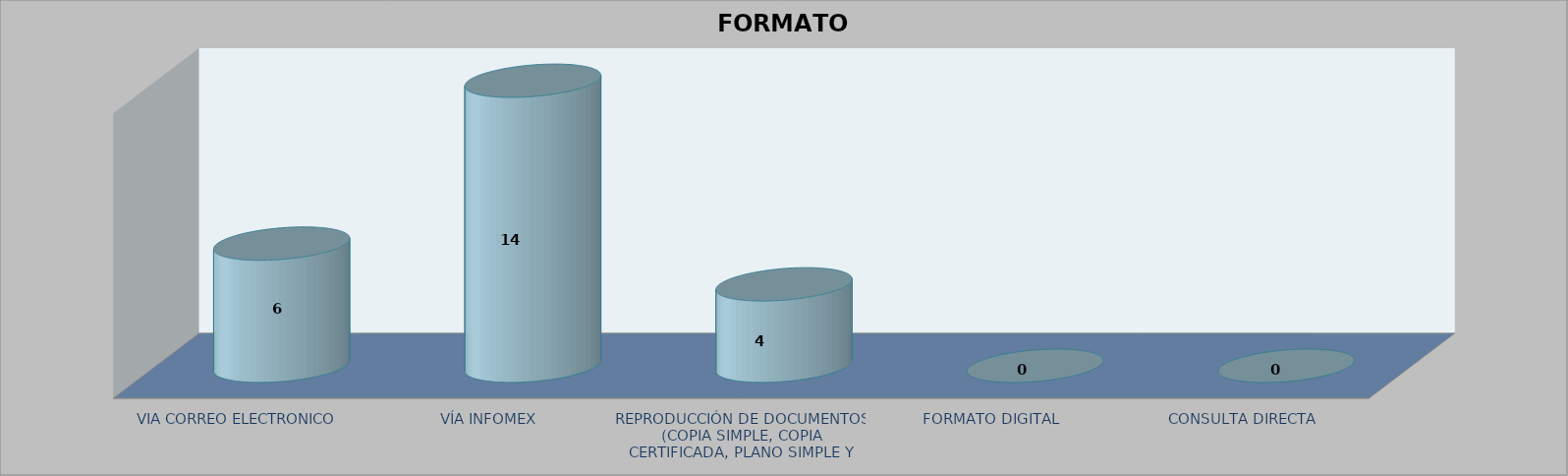
| Category |        FORMATO SOLICITADO | Series 1 | Series 2 |
|---|---|---|---|
| VIA CORREO ELECTRONICO |  |  | 6 |
| VÍA INFOMEX |  |  | 14 |
| REPRODUCCIÓN DE DOCUMENTOS (COPIA SIMPLE, COPIA CERTIFICADA, PLANO SIMPLE Y PLANO CERTIFICADO) |  |  | 4 |
| FORMATO DIGITAL |  |  | 0 |
| CONSULTA DIRECTA |  |  | 0 |